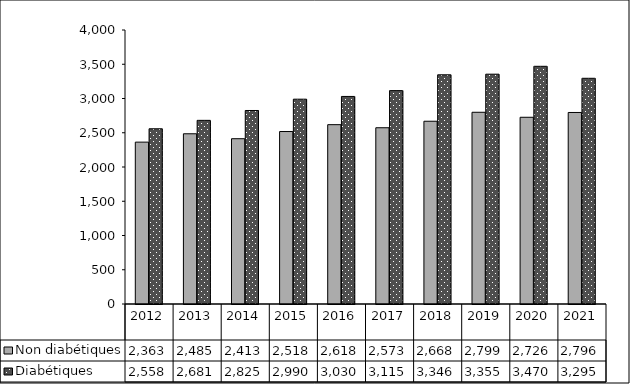
| Category | Non diabétiques | Diabétiques |
|---|---|---|
| 2012 | 2363 | 2558 |
| 2013 | 2485 | 2681 |
| 2014 | 2413 | 2825 |
| 2015 | 2518 | 2990 |
| 2016 | 2618 | 3030 |
| 2017 | 2573 | 3115 |
| 2018 | 2668 | 3346 |
| 2019 | 2799 | 3355 |
| 2020 | 2726 | 3470 |
| 2021 | 2796 | 3295 |